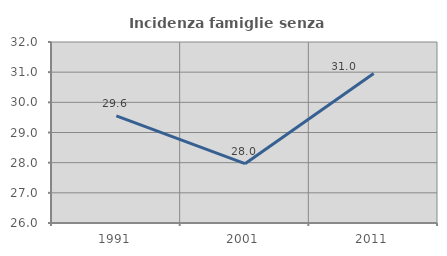
| Category | Incidenza famiglie senza nuclei |
|---|---|
| 1991.0 | 29.552 |
| 2001.0 | 27.965 |
| 2011.0 | 30.952 |